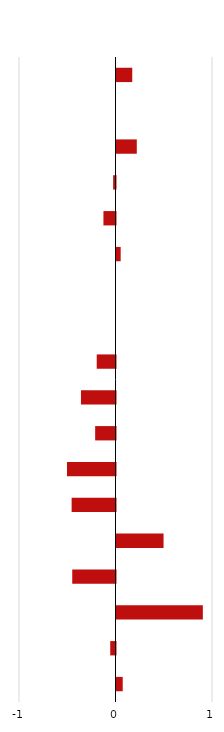
| Category | Series 0 |
|---|---|
| 0 | 2.388 |
| 1 | -0.129 |
| 2 | 0.282 |
| 3 | -0.829 |
| 4 | 0.25 |
| 5 | -0.108 |
| 6 | -0.016 |
| 7 | 0.021 |
| 8 | -0.107 |
| 9 | -0.367 |
| 10 | -0.287 |
| 11 | -0.551 |
| 12 | -0.727 |
| 13 | 0.593 |
| 14 | -0.839 |
| 15 | 0.5 |
| 16 | 0.025 |
| 17 | -0.081 |